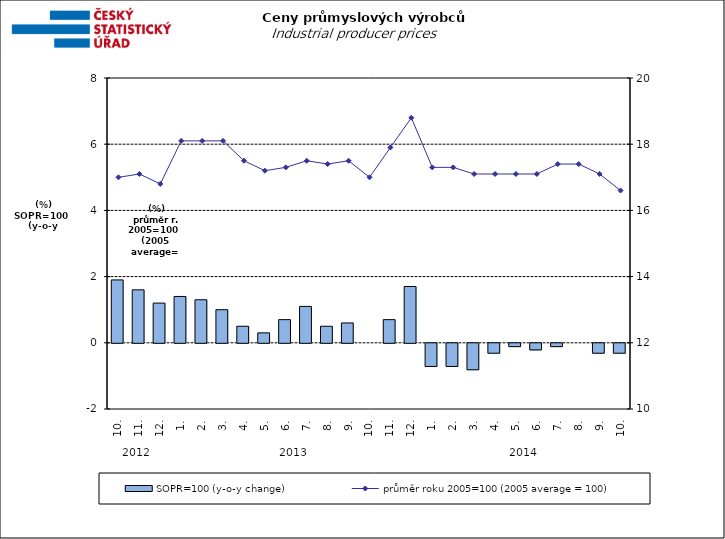
| Category | SOPR=100 (y-o-y change)   |
|---|---|
| 0 | 1.9 |
| 1 | 1.6 |
| 2 | 1.2 |
| 3 | 1.4 |
| 4 | 1.3 |
| 5 | 1 |
| 6 | 0.5 |
| 7 | 0.3 |
| 8 | 0.7 |
| 9 | 1.1 |
| 10 | 0.5 |
| 11 | 0.6 |
| 12 | 0 |
| 13 | 0.7 |
| 14 | 1.7 |
| 15 | -0.7 |
| 16 | -0.7 |
| 17 | -0.8 |
| 18 | -0.3 |
| 19 | -0.1 |
| 20 | -0.2 |
| 21 | -0.1 |
| 22 | 0 |
| 23 | -0.3 |
| 24 | -0.3 |